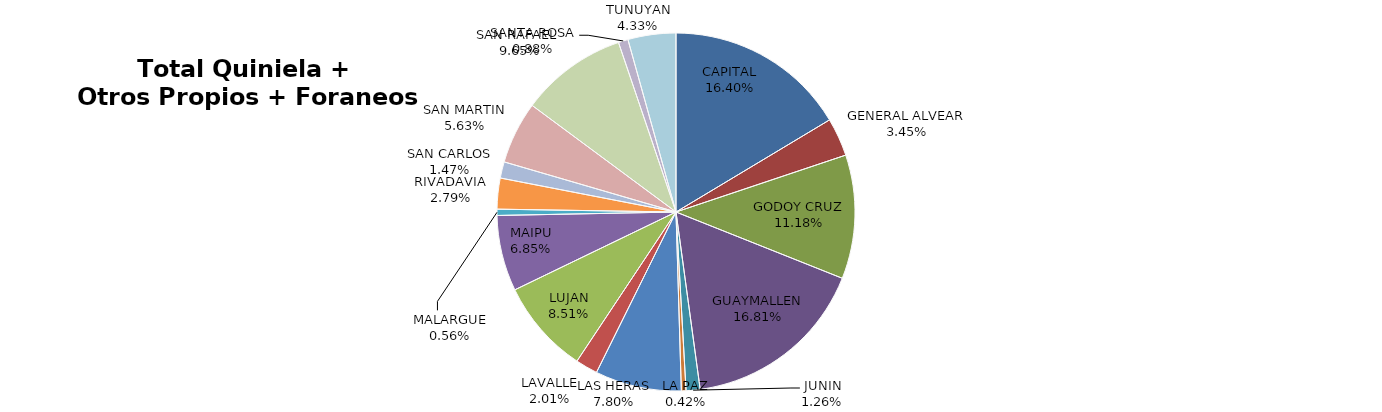
| Category | Total Quiniela + Otros Propios + Foraneos (Beneficio) |
|---|---|
| CAPITAL | 4318887.39 |
| GENERAL ALVEAR | 909826.04 |
| GODOY CRUZ | 2945038.37 |
| GUAYMALLEN | 4426078.81 |
| JUNIN | 332065.79 |
| LA PAZ | 110686.32 |
| LAS HERAS | 2054329.5 |
| LAVALLE | 528629.24 |
| LUJAN | 2240683.73 |
| MAIPU | 1804042.06 |
| MALARGUE | 148377.28 |
| RIVADAVIA | 734618.9 |
| SAN CARLOS | 387846.07 |
| SAN MARTIN | 1483503.65 |
| SAN RAFAEL  | 2540686.3 |
| SANTA ROSA | 231221.84 |
| TUNUYAN | 1139506.99 |